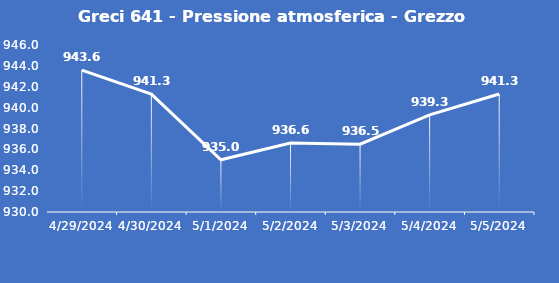
| Category | Greci 641 - Pressione atmosferica - Grezzo (hPa) |
|---|---|
| 4/29/24 | 943.6 |
| 4/30/24 | 941.3 |
| 5/1/24 | 935 |
| 5/2/24 | 936.6 |
| 5/3/24 | 936.5 |
| 5/4/24 | 939.3 |
| 5/5/24 | 941.3 |